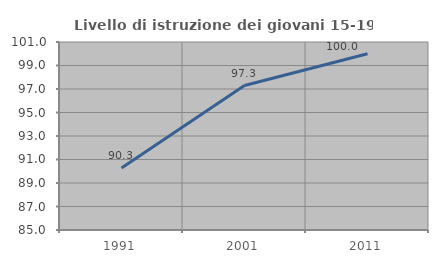
| Category | Livello di istruzione dei giovani 15-19 anni |
|---|---|
| 1991.0 | 90.278 |
| 2001.0 | 97.297 |
| 2011.0 | 100 |